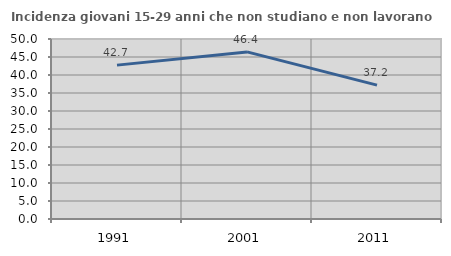
| Category | Incidenza giovani 15-29 anni che non studiano e non lavorano  |
|---|---|
| 1991.0 | 42.743 |
| 2001.0 | 46.417 |
| 2011.0 | 37.19 |